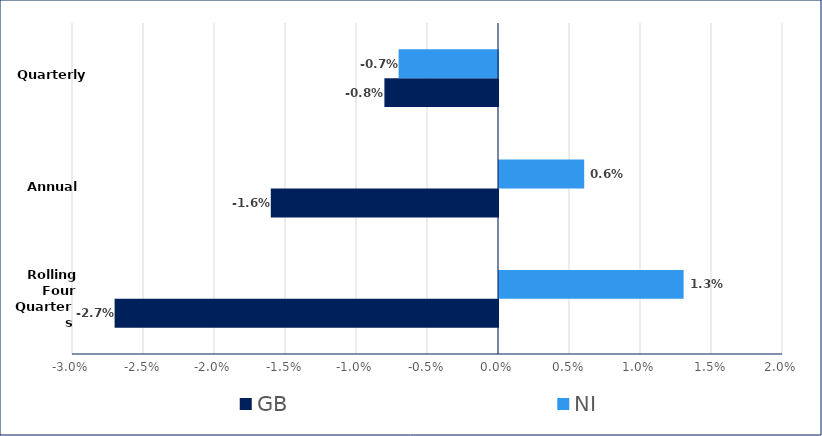
| Category | GB | NI |
|---|---|---|
|  | -0.027 | 0.013 |
|  | -0.016 | 0.006 |
|  | -0.008 | -0.007 |